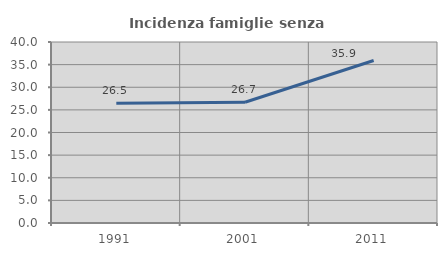
| Category | Incidenza famiglie senza nuclei |
|---|---|
| 1991.0 | 26.465 |
| 2001.0 | 26.681 |
| 2011.0 | 35.902 |